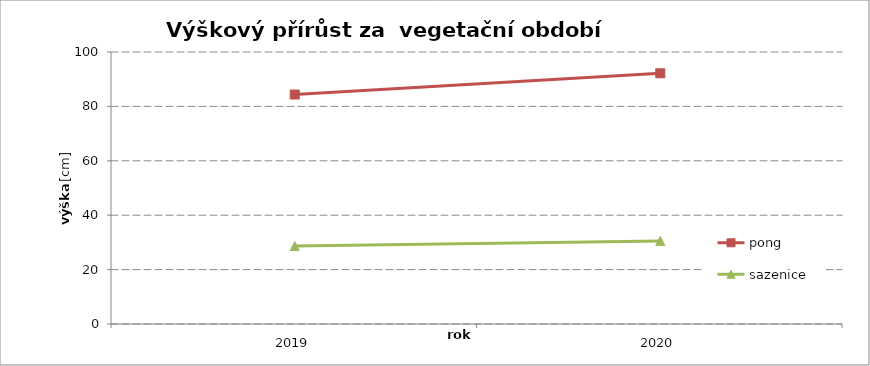
| Category | pong | sazenice |
|---|---|---|
| 2019.0 | 84.365 | 28.664 |
| 2020.0 | 92.173 | 30.56 |